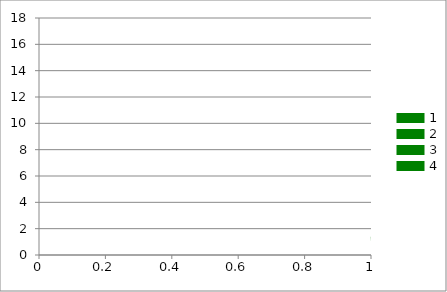
| Category | Series 0 |
|---|---|
| 0 | 1 |
| 1 | 2 |
| 2 | 4 |
| 3 | 16 |